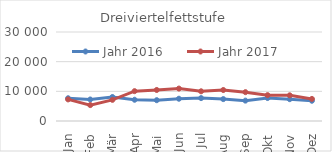
| Category | Jahr 2016 | Jahr 2017 |
|---|---|---|
| 0 | 7673.158 | 7280.197 |
| 1 | 7251.138 | 5359.434 |
| 2 | 8087.788 | 7128.81 |
| 3 | 7164.972 | 10059.247 |
| 4 | 7013.496 | 10461.161 |
| 5 | 7506.867 | 10929.937 |
| 6 | 7717.79 | 10012.572 |
| 7 | 7379.073 | 10444.865 |
| 8 | 6868.371 | 9721.094 |
| 9 | 7740.645 | 8717.698 |
| 10 | 7359.188 | 8660.162 |
| 11 | 6827.581 | 7442.847 |